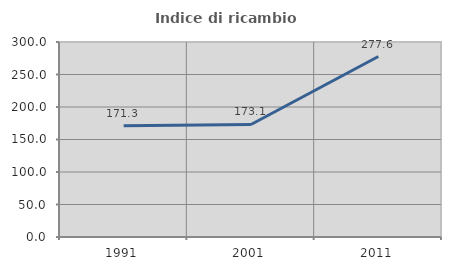
| Category | Indice di ricambio occupazionale  |
|---|---|
| 1991.0 | 171.341 |
| 2001.0 | 173.083 |
| 2011.0 | 277.647 |